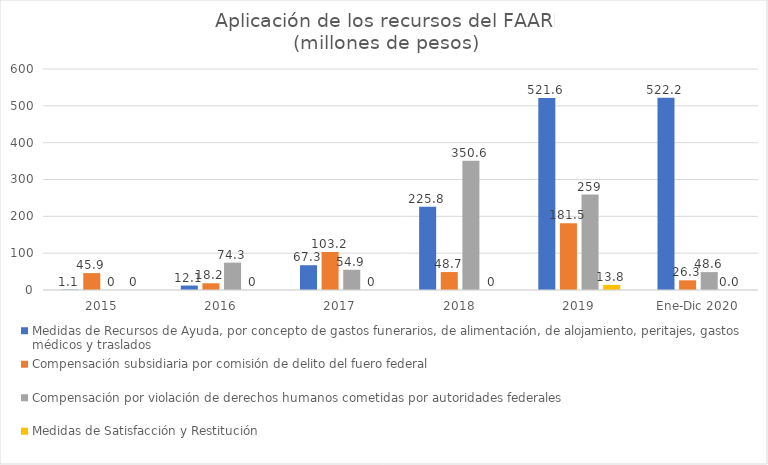
| Category | Medidas de Recursos de Ayuda, por concepto de gastos funerarios, de alimentación, de alojamiento, peritajes, gastos médicos y traslados | Compensación subsidiaria por comisión de delito del fuero federal | Compensación por violación de derechos humanos cometidas por autoridades federales | Medidas de Satisfacción y Restitución |
|---|---|---|---|---|
| 2015 | 1.1 | 45.9 | 0 | 0 |
| 2016 | 12.1 | 18.2 | 74.3 | 0 |
| 2017 | 67.3 | 103.2 | 54.9 | 0 |
| 2018 | 225.8 | 48.7 | 350.6 | 0 |
| 2019 | 521.6 | 181.5 | 259 | 13.8 |
| Ene-Dic 2020 | 522.191 | 26.264 | 48.591 | 0 |